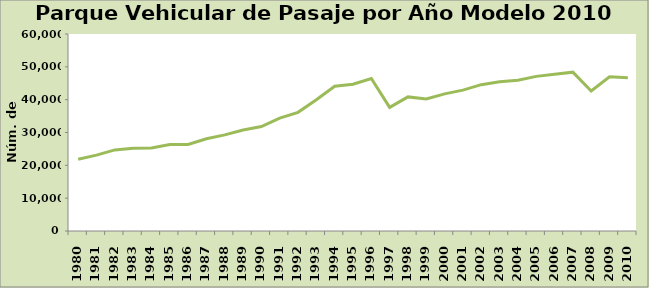
| Category | Series 0 |
|---|---|
| 1980.0 | 21840 |
| 1981.0 | 23120 |
| 1982.0 | 24701 |
| 1983.0 | 25225 |
| 1984.0 | 25268 |
| 1985.0 | 26316 |
| 1986.0 | 26382 |
| 1987.0 | 28073 |
| 1988.0 | 29279 |
| 1989.0 | 30735 |
| 1990.0 | 31811 |
| 1991.0 | 34380 |
| 1992.0 | 36140 |
| 1993.0 | 39997 |
| 1994.0 | 44109 |
| 1995.0 | 44711 |
| 1996.0 | 46427 |
| 1997.0 | 37643 |
| 1998.0 | 40846 |
| 1999.0 | 40197 |
| 2000.0 | 41758 |
| 2001.0 | 42899 |
| 2002.0 | 44573 |
| 2003.0 | 45485 |
| 2004.0 | 45906 |
| 2005.0 | 47092 |
| 2006.0 | 47751 |
| 2007.0 | 48374 |
| 2008.0 | 42648 |
| 2009.0 | 46948 |
| 2010.0 | 46658 |